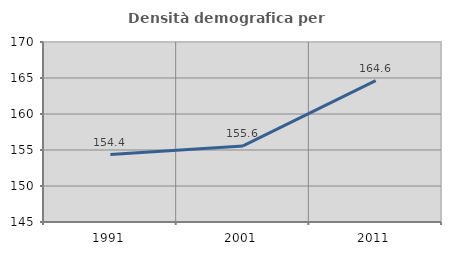
| Category | Densità demografica |
|---|---|
| 1991.0 | 154.367 |
| 2001.0 | 155.562 |
| 2011.0 | 164.626 |